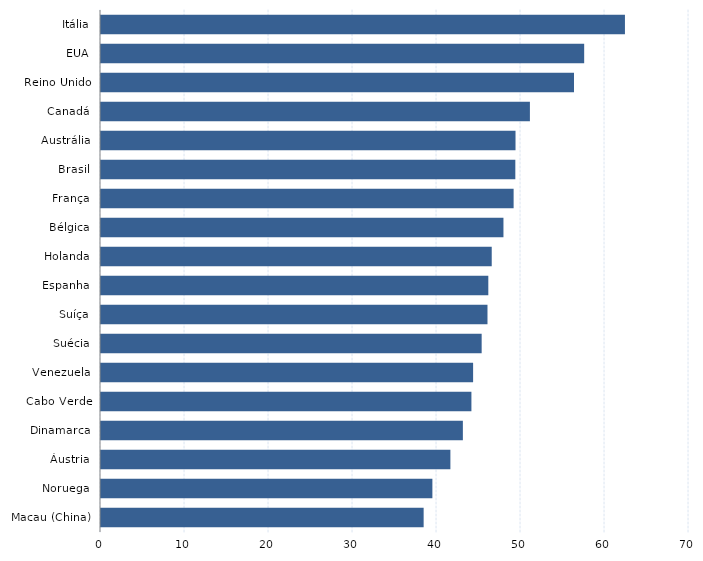
| Category | Series 0 |
|---|---|
| Macau (China) | 38.409 |
| Noruega | 39.45 |
| Áustria | 41.595 |
| Dinamarca | 43.08 |
| Cabo Verde | 44.098 |
| Venezuela | 44.299 |
| Suécia | 45.316 |
| Suíça | 46.01 |
| Espanha | 46.109 |
| Holanda | 46.515 |
| Bélgica | 47.911 |
| França | 49.122 |
| Brasil | 49.325 |
| Austrália | 49.347 |
| Canadá | 51.06 |
| Reino Unido | 56.309 |
| EUA | 57.521 |
| Itália | 62.374 |